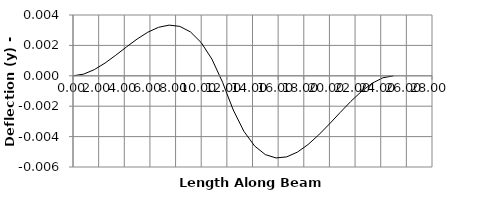
| Category | y |
|---|---|
| 0.0 | 0 |
| 0.0 | 0 |
| 0.8333333333333334 | 0 |
| 1.6666666666666667 | 0 |
| 2.5 | 0.001 |
| 3.3333333333333335 | 0.001 |
| 4.166666666666667 | 0.002 |
| 5.0 | 0.002 |
| 5.833333333333334 | 0.003 |
| 6.666666666666667 | 0.003 |
| 7.5 | 0.003 |
| 8.333333333333334 | 0.003 |
| 9.166666666666668 | 0.003 |
| 10.0 | 0.002 |
| 10.833333333333334 | 0.001 |
| 11.666666666666668 | 0 |
| 11.9999 | -0.001 |
| 12.0001 | -0.001 |
| 12.5 | -0.002 |
| 13.333333333333334 | -0.004 |
| 14.166666666666668 | -0.005 |
| 15.0 | -0.005 |
| 15.833333333333334 | -0.005 |
| 16.666666666666668 | -0.005 |
| 17.5 | -0.005 |
| 18.333333333333336 | -0.005 |
| 19.166666666666668 | -0.004 |
| 20.0 | -0.003 |
| 20.833333333333336 | -0.002 |
| 21.666666666666668 | -0.002 |
| 22.5 | -0.001 |
| 23.333333333333336 | 0 |
| 24.166666666666668 | 0 |
| 25.0 | 0 |